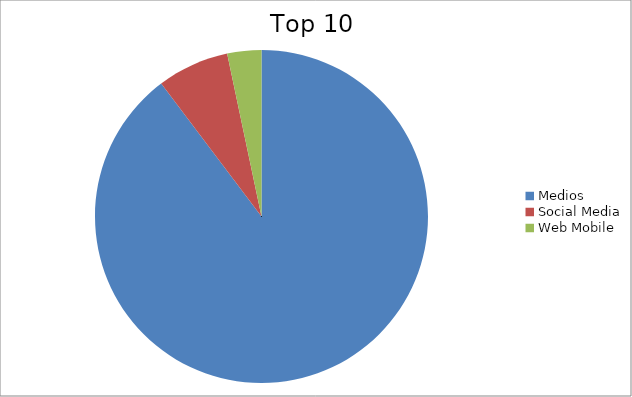
| Category | Series 0 |
|---|---|
| Medios | 89.71 |
| Social Media | 6.98 |
| Web Mobile | 3.31 |